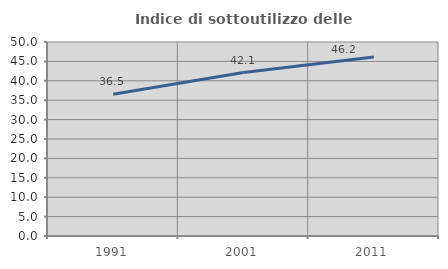
| Category | Indice di sottoutilizzo delle abitazioni  |
|---|---|
| 1991.0 | 36.51 |
| 2001.0 | 42.127 |
| 2011.0 | 46.154 |